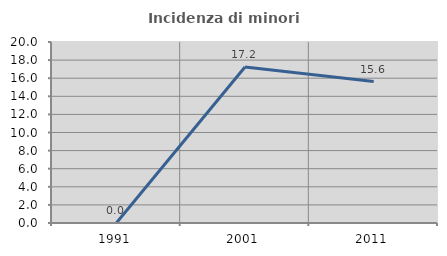
| Category | Incidenza di minori stranieri |
|---|---|
| 1991.0 | 0 |
| 2001.0 | 17.241 |
| 2011.0 | 15.625 |